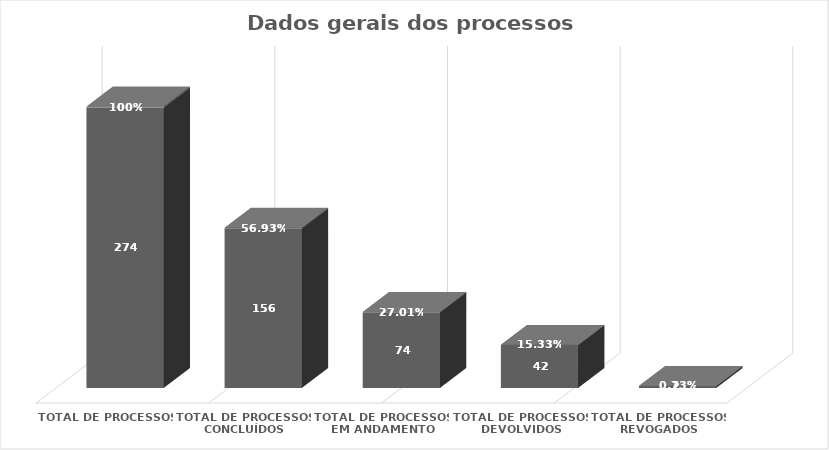
| Category | Series 0 | Series 1 |
|---|---|---|
| Total de processos | 274 | 1 |
| Total de processos concluídos | 156 | 0.569 |
| Total de processos em andamento | 74 | 0.27 |
| Total de processos devolvidos | 42 | 0.153 |
| Total de processos revogados | 2 | 0.007 |